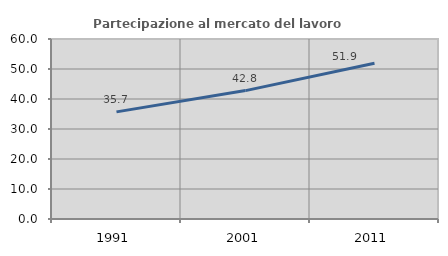
| Category | Partecipazione al mercato del lavoro  femminile |
|---|---|
| 1991.0 | 35.714 |
| 2001.0 | 42.802 |
| 2011.0 | 51.937 |